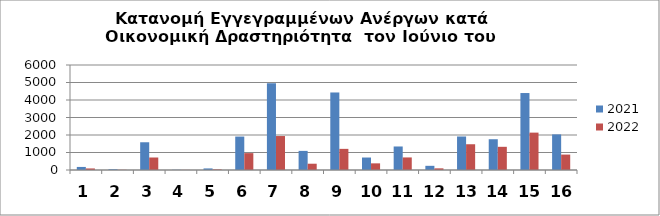
| Category | 2021 | 2022 |
|---|---|---|
| 0 | 175 | 89 |
| 1 | 42 | 11 |
| 2 | 1585 | 714 |
| 3 | 12 | 6 |
| 4 | 90 | 33 |
| 5 | 1911 | 964 |
| 6 | 4956 | 1941 |
| 7 | 1092 | 359 |
| 8 | 4430 | 1208 |
| 9 | 713 | 380 |
| 10 | 1344 | 718 |
| 11 | 239 | 95 |
| 12 | 1915 | 1472 |
| 13 | 1758 | 1325 |
| 14 | 4398 | 2136 |
| 15 | 2034 | 881 |